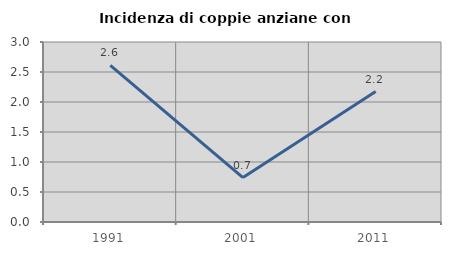
| Category | Incidenza di coppie anziane con figli |
|---|---|
| 1991.0 | 2.609 |
| 2001.0 | 0.741 |
| 2011.0 | 2.174 |